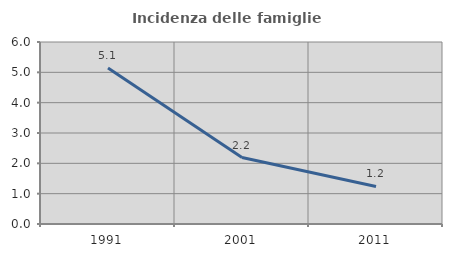
| Category | Incidenza delle famiglie numerose |
|---|---|
| 1991.0 | 5.141 |
| 2001.0 | 2.192 |
| 2011.0 | 1.238 |